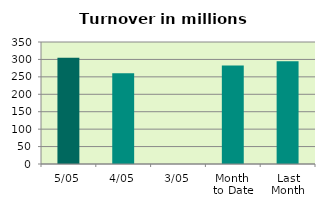
| Category | Series 0 |
|---|---|
| 5/05 | 304.587 |
| 4/05 | 260.251 |
| 3/05 | 0 |
| Month 
to Date | 282.419 |
| Last
Month | 294.539 |